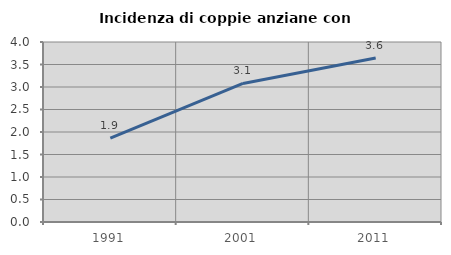
| Category | Incidenza di coppie anziane con figli |
|---|---|
| 1991.0 | 1.864 |
| 2001.0 | 3.078 |
| 2011.0 | 3.643 |